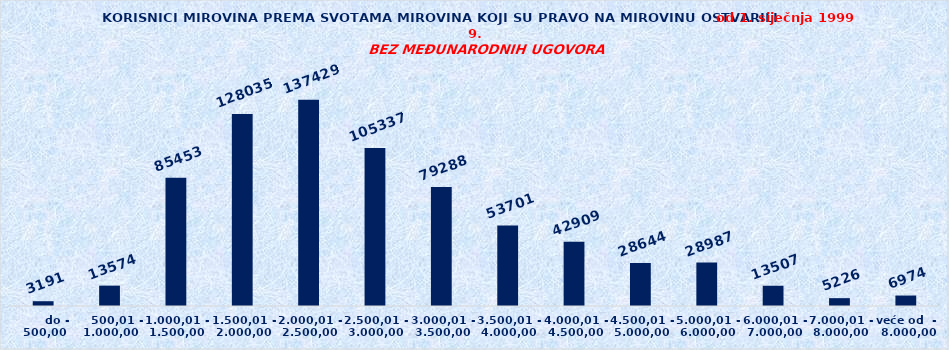
| Category | Series 0 |
|---|---|
|       do - 500,00 | 3191 |
|    500,01 - 1.000,00 | 13574 |
| 1.000,01 - 1.500,00 | 85453 |
| 1.500,01 - 2.000,00 | 128035 |
| 2.000,01 - 2.500,00 | 137429 |
| 2.500,01 - 3.000,00 | 105337 |
| 3.000,01 - 3.500,00 | 79288 |
| 3.500,01 - 4.000,00 | 53701 |
| 4.000,01 - 4.500,00 | 42909 |
| 4.500,01 - 5.000,00 | 28644 |
| 5.000,01 - 6.000,00 | 28987 |
| 6.000,01 - 7.000,00 | 13507 |
| 7.000,01 - 8.000,00 | 5226 |
| veće od  -  8.000,00 | 6974 |